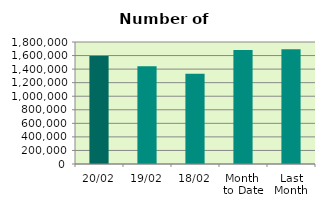
| Category | Series 0 |
|---|---|
| 20/02 | 1593924 |
| 19/02 | 1443194 |
| 18/02 | 1332954 |
| Month 
to Date | 1683358.286 |
| Last
Month | 1692009 |